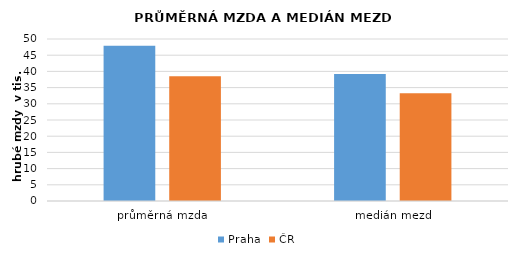
| Category | Praha | ČR |
|---|---|---|
| průměrná mzda | 47924 | 38527 |
| medián mezd | 39233 | 33256 |